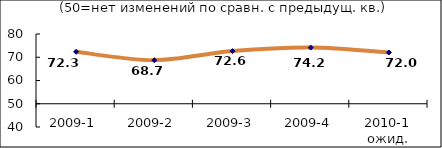
| Category | Диф.индекс ↓ |
|---|---|
| 2009-1 | 72.335 |
| 2009-2 | 68.745 |
| 2009-3 | 72.645 |
| 2009-4 | 74.155 |
| 2010-1 ожид. | 72.04 |